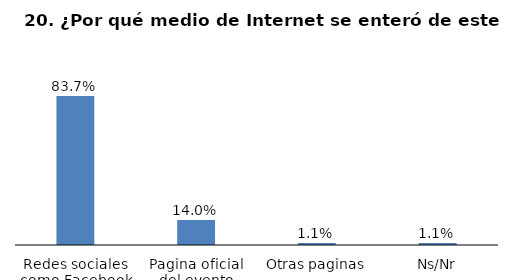
| Category | Series 0 |
|---|---|
| Redes sociales como Facebook o Twitter | 0.837 |
| Pagina oficial del evento | 0.14 |
| Otras paginas | 0.011 |
| Ns/Nr | 0.011 |